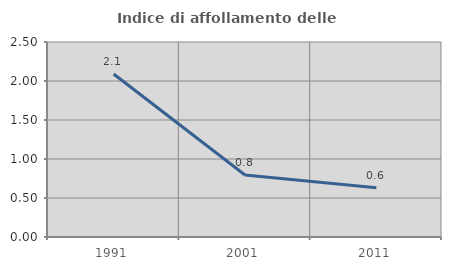
| Category | Indice di affollamento delle abitazioni  |
|---|---|
| 1991.0 | 2.09 |
| 2001.0 | 0.795 |
| 2011.0 | 0.632 |